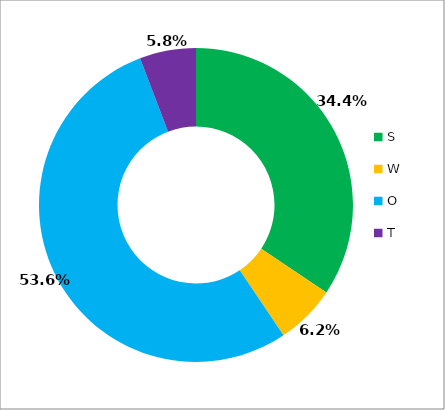
| Category | Series 0 |
|---|---|
| S | 13.029 |
| W | 2.346 |
| O | 20.306 |
| T | 2.196 |